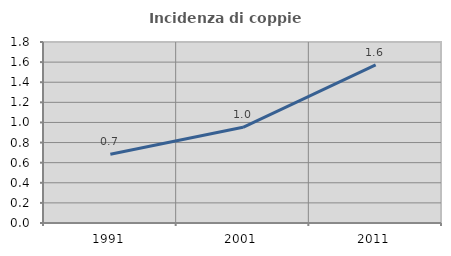
| Category | Incidenza di coppie miste |
|---|---|
| 1991.0 | 0.685 |
| 2001.0 | 0.952 |
| 2011.0 | 1.572 |